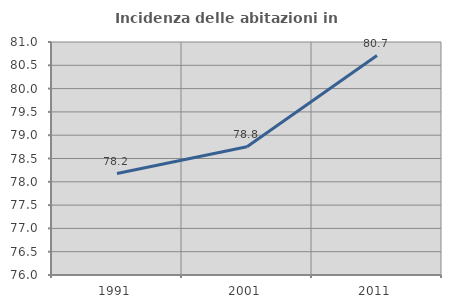
| Category | Incidenza delle abitazioni in proprietà  |
|---|---|
| 1991.0 | 78.177 |
| 2001.0 | 78.753 |
| 2011.0 | 80.708 |